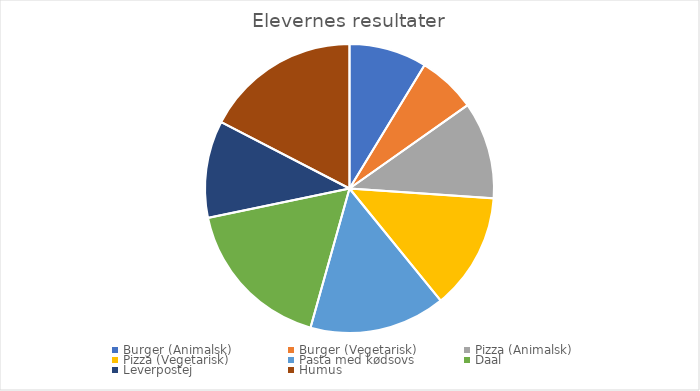
| Category | Series 0 |
|---|---|
| Burger (Animalsk) | 4 |
| Burger (Vegetarisk) | 3 |
| Pizza (Animalsk) | 5 |
| Pizza (Vegetarisk) | 6 |
| Pasta med kødsovs | 7 |
| Daal | 8 |
| Leverpostej | 5 |
| Humus | 8 |